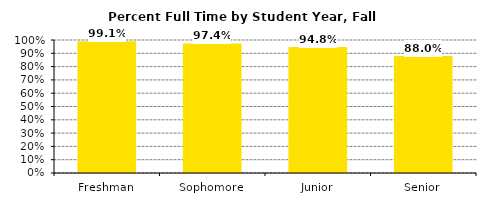
| Category | Series 0 |
|---|---|
| Freshman | 0.991 |
| Sophomore | 0.974 |
| Junior | 0.948 |
| Senior | 0.88 |